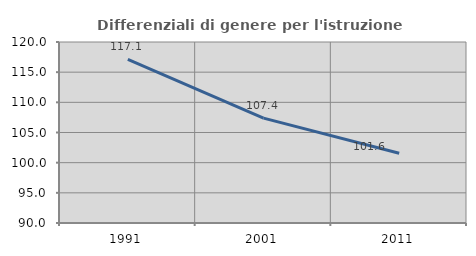
| Category | Differenziali di genere per l'istruzione superiore |
|---|---|
| 1991.0 | 117.102 |
| 2001.0 | 107.382 |
| 2011.0 | 101.572 |